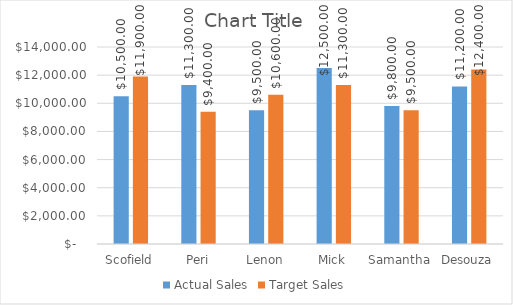
| Category | Actual Sales | Target Sales |
|---|---|---|
| Scofield | 10500 | 11900 |
| Peri | 11300 | 9400 |
| Lenon | 9500 | 10600 |
| Mick | 12500 | 11300 |
| Samantha | 9800 | 9500 |
| Desouza | 11200 | 12400 |